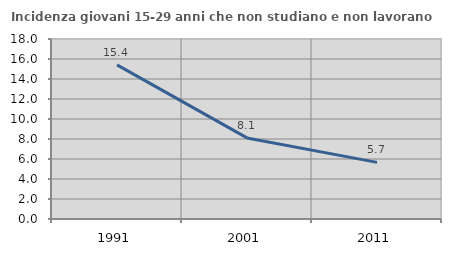
| Category | Incidenza giovani 15-29 anni che non studiano e non lavorano  |
|---|---|
| 1991.0 | 15.418 |
| 2001.0 | 8.108 |
| 2011.0 | 5.66 |